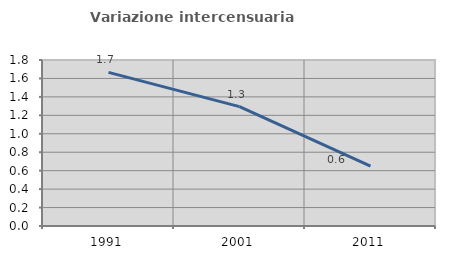
| Category | Variazione intercensuaria annua |
|---|---|
| 1991.0 | 1.666 |
| 2001.0 | 1.294 |
| 2011.0 | 0.649 |